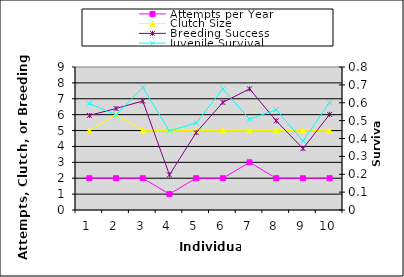
| Category | Attempts per Year | Clutch Size | Breeding Success |
|---|---|---|---|
| 1.0 | 2 | 5 | 5.952 |
| 2.0 | 2 | 6 | 6.39 |
| 3.0 | 2 | 5 | 6.858 |
| 4.0 | 1 | 5 | 2.21 |
| 5.0 | 2 | 5 | 4.872 |
| 6.0 | 2 | 5 | 6.772 |
| 7.0 | 3 | 5 | 7.621 |
| 8.0 | 2 | 5 | 5.61 |
| 9.0 | 2 | 5 | 3.865 |
| 10.0 | 2 | 5 | 6.018 |